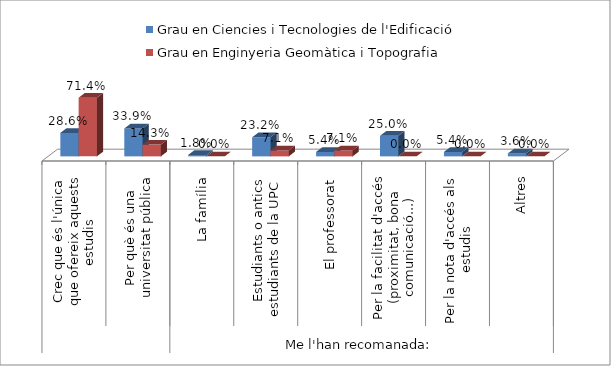
| Category | Grau en Ciencies i Tecnologies de l'Edificació | Grau en Enginyeria Geomàtica i Topografia |
|---|---|---|
| 0 | 0.286 | 0.714 |
| 1 | 0.339 | 0.143 |
| 2 | 0.018 | 0 |
| 3 | 0.232 | 0.071 |
| 4 | 0.054 | 0.071 |
| 5 | 0.25 | 0 |
| 6 | 0.054 | 0 |
| 7 | 0.036 | 0 |